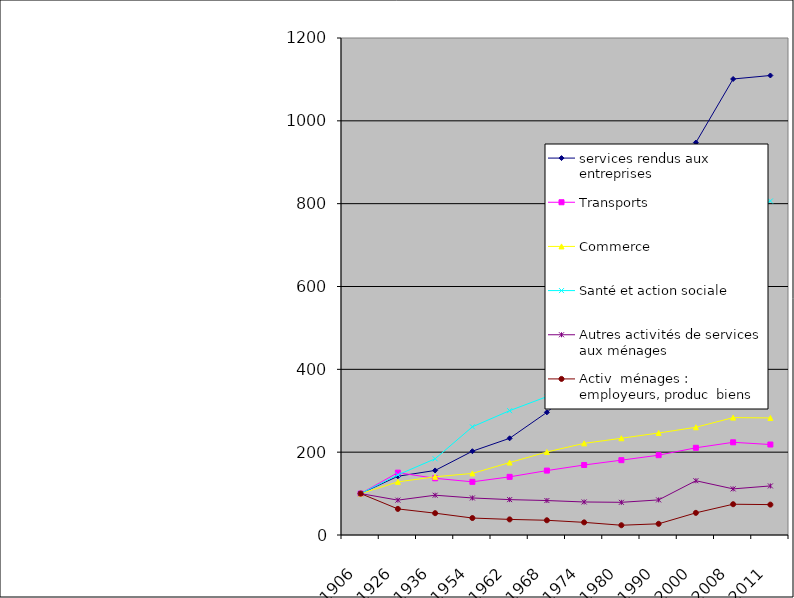
| Category | services rendus aux entreprises | Transports | Commerce | Santé et action sociale | Autres activités de services aux ménages | Activ  ménages : employeurs, produc  biens  |
|---|---|---|---|---|---|---|
| 1906.0 | 100 | 100 | 100 | 100 | 100 | 100 |
| 1926.0 | 141.887 | 150.556 | 128.284 | 145.205 | 84.183 | 62.994 |
| 1936.0 | 155.875 | 136.901 | 140.522 | 184.017 | 96.074 | 52.692 |
| 1954.0 | 202.292 | 128.369 | 148.657 | 261.182 | 89.415 | 40.96 |
| 1962.0 | 233.478 | 140.414 | 174.887 | 300.214 | 85.443 | 37.653 |
| 1968.0 | 296.121 | 155.535 | 200.51 | 334.064 | 83.218 | 35.559 |
| 1974.0 | 375.384 | 169.021 | 221.23 | 380.121 | 79.729 | 30.487 |
| 1980.0 | 466.646 | 180.695 | 233.599 | 430.991 | 78.913 | 23.544 |
| 1990.0 | 670.839 | 192.713 | 246.304 | 533.04 | 84.756 | 27.018 |
| 2000.0 | 947.478 | 210.54 | 260.087 | 668.182 | 131.053 | 53.477 |
| 2008.0 | 1101.007 | 223.797 | 283.437 | 760.905 | 111.358 | 74.301 |
| 2011.0 | 1109.47 | 218.444 | 282.617 | 806.432 | 118.463 | 73.353 |